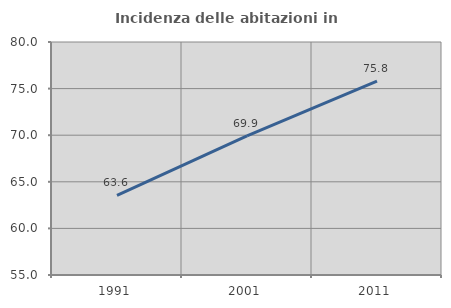
| Category | Incidenza delle abitazioni in proprietà  |
|---|---|
| 1991.0 | 63.554 |
| 2001.0 | 69.938 |
| 2011.0 | 75.8 |